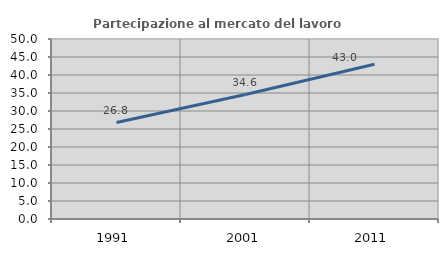
| Category | Partecipazione al mercato del lavoro  femminile |
|---|---|
| 1991.0 | 26.797 |
| 2001.0 | 34.581 |
| 2011.0 | 43.006 |